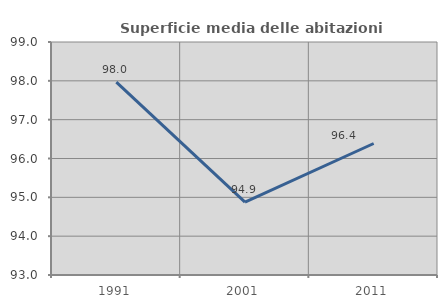
| Category | Superficie media delle abitazioni occupate |
|---|---|
| 1991.0 | 97.966 |
| 2001.0 | 94.879 |
| 2011.0 | 96.386 |